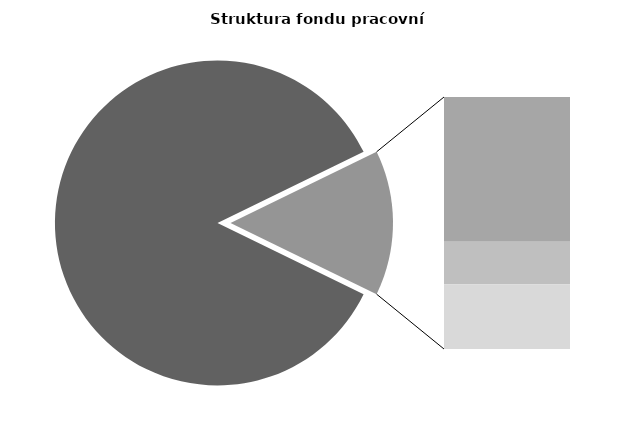
| Category | Series 0 |
|---|---|
| Průměrná měsíční odpracovaná doba bez přesčasu | 147.24 |
| Dovolená | 14.254 |
| Nemoc | 4.189 |
| Jiné | 6.381 |